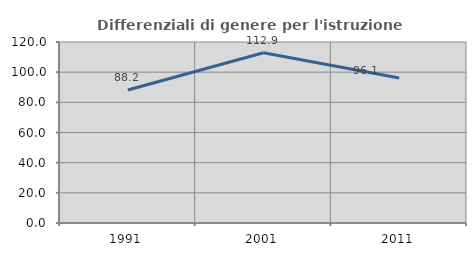
| Category | Differenziali di genere per l'istruzione superiore |
|---|---|
| 1991.0 | 88.213 |
| 2001.0 | 112.865 |
| 2011.0 | 96.147 |